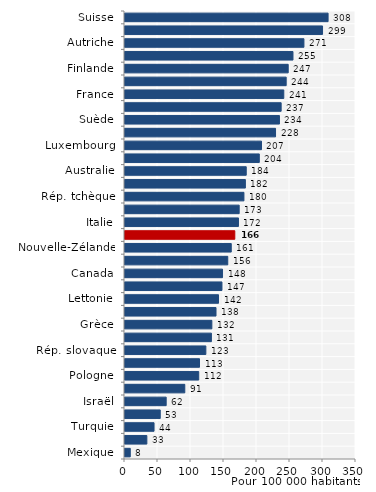
| Category | Series 0 |
|---|---|
| Mexique | 8 |
| Chili | 33.1 |
| Turquie | 44 |
| Corée | 53.4 |
| Israël | 62.4 |
| Portugal | 90.6 |
| Pologne | 111.7 |
| Espagne | 112.9 |
| Rép. slovaque | 122.5 |
| Irlande | 130.9 |
| Grèce | 131.6 |
| Hongrie | 137.9 |
| Lettonie | 141.7 |
| Islande | 146.9 |
| Canada | 147.8 |
| Estonie | 155.7 |
| Nouvelle-Zélande | 161 |
| OCDE34 | 166.382 |
| Italie | 171.9 |
| Slovénie | 173 |
| Rép. tchèque | 180.2 |
| Royaume-Uni | 182.4 |
| Australie | 183.7 |
| Etats-Unis | 203.5 |
| Luxembourg | 206.8 |
| Pays-Bas | 228.1 |
| Suède | 234 |
| Danemark | 236.6 |
| France | 240.6 |
| Norvège | 244.2 |
| Finlande | 247.3 |
| Belgique | 254.5 |
| Autriche | 271.1 |
| Allemagne | 299.3 |
| Suisse | 307.7 |